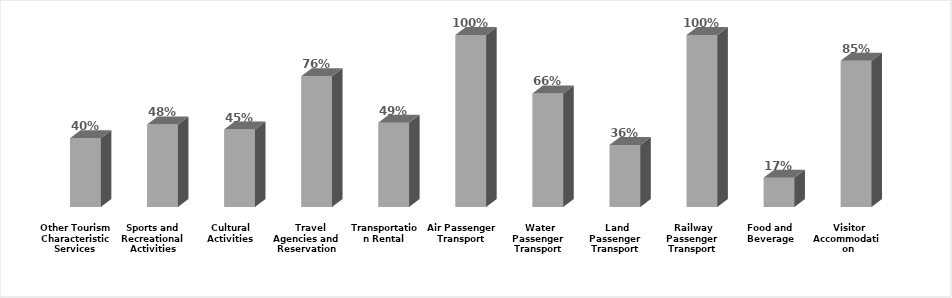
| Category | Series 0 |
|---|---|
|  Visitor Accommodation | 0.85 |
| Food and Beverage | 0.17 |
|  Railway Passenger Transport | 1 |
|  Land Passenger Transport | 0.36 |
|  Water Passenger Transport | 0.66 |
|  Air Passenger Transport | 1 |
|  Transportation Rental | 0.49 |
|   Travel Agencies and Reservation Services | 0.76 |
| Cultural Activities | 0.45 |
| Sports and Recreational Activities | 0.48 |
| Other Tourism Characteristic Services  | 0.4 |